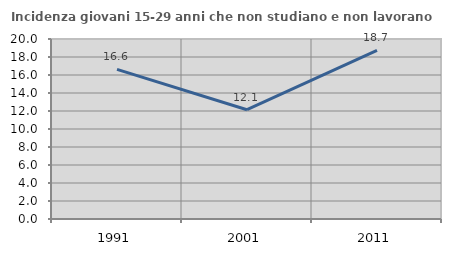
| Category | Incidenza giovani 15-29 anni che non studiano e non lavorano  |
|---|---|
| 1991.0 | 16.621 |
| 2001.0 | 12.142 |
| 2011.0 | 18.745 |